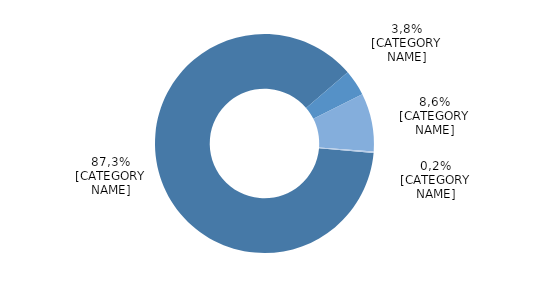
| Category | Series 0 |
|---|---|
| Sume plătite regulat | 87.34 |
| Sume plătite neregulat | 3.835 |
| Sume calculate pentru timpul nelucrat | 8.614 |
| Drepturi în natură | 0.211 |